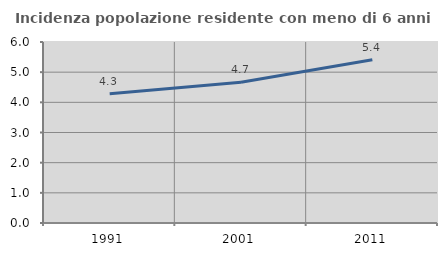
| Category | Incidenza popolazione residente con meno di 6 anni |
|---|---|
| 1991.0 | 4.285 |
| 2001.0 | 4.669 |
| 2011.0 | 5.412 |